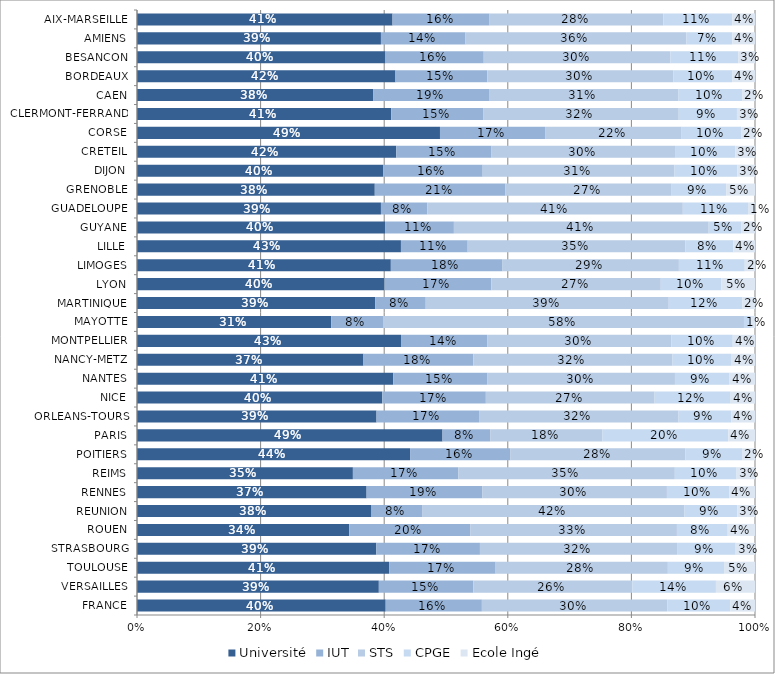
| Category | Université | IUT | STS | CPGE | Ecole Ingé |
|---|---|---|---|---|---|
| AIX-MARSEILLE | 0.414 | 0.157 | 0.281 | 0.112 | 0.037 |
| AMIENS | 0.395 | 0.137 | 0.357 | 0.075 | 0.037 |
| BESANCON | 0.402 | 0.159 | 0.302 | 0.11 | 0.027 |
| BORDEAUX | 0.418 | 0.149 | 0.301 | 0.095 | 0.037 |
| CAEN | 0.382 | 0.189 | 0.305 | 0.103 | 0.021 |
| CLERMONT-FERRAND | 0.411 | 0.149 | 0.316 | 0.094 | 0.029 |
| CORSE | 0.49 | 0.17 | 0.221 | 0.096 | 0.022 |
| CRETEIL | 0.42 | 0.153 | 0.298 | 0.097 | 0.032 |
| DIJON | 0.398 | 0.161 | 0.31 | 0.102 | 0.028 |
| GRENOBLE | 0.385 | 0.212 | 0.269 | 0.088 | 0.047 |
| GUADELOUPE | 0.395 | 0.075 | 0.413 | 0.106 | 0.011 |
| GUYANE | 0.401 | 0.111 | 0.412 | 0.052 | 0.023 |
| LILLE | 0.427 | 0.108 | 0.352 | 0.077 | 0.035 |
| LIMOGES | 0.411 | 0.181 | 0.285 | 0.107 | 0.017 |
| LYON | 0.4 | 0.173 | 0.274 | 0.098 | 0.054 |
| MARTINIQUE | 0.386 | 0.082 | 0.393 | 0.119 | 0.02 |
| MAYOTTE | 0.314 | 0.084 | 0.584 | 0.011 | 0.007 |
| MONTPELLIER | 0.427 | 0.139 | 0.298 | 0.099 | 0.036 |
| NANCY-METZ | 0.366 | 0.178 | 0.322 | 0.096 | 0.038 |
| NANTES | 0.415 | 0.153 | 0.303 | 0.088 | 0.041 |
| NICE | 0.397 | 0.168 | 0.273 | 0.123 | 0.039 |
| ORLEANS-TOURS | 0.388 | 0.166 | 0.323 | 0.085 | 0.038 |
| PARIS | 0.494 | 0.078 | 0.181 | 0.203 | 0.043 |
| POITIERS | 0.442 | 0.163 | 0.283 | 0.091 | 0.021 |
| REIMS | 0.349 | 0.171 | 0.35 | 0.1 | 0.03 |
| RENNES | 0.372 | 0.187 | 0.298 | 0.101 | 0.041 |
| REUNION | 0.379 | 0.082 | 0.424 | 0.086 | 0.029 |
| ROUEN | 0.343 | 0.196 | 0.334 | 0.082 | 0.044 |
| STRASBOURG | 0.387 | 0.168 | 0.319 | 0.095 | 0.031 |
| TOULOUSE | 0.408 | 0.172 | 0.279 | 0.091 | 0.05 |
| VERSAILLES | 0.391 | 0.153 | 0.257 | 0.135 | 0.063 |
| FRANCE | 0.402 | 0.156 | 0.3 | 0.102 | 0.04 |